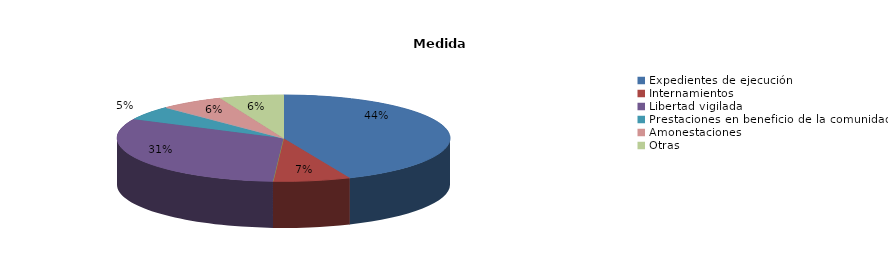
| Category | Series 0 |
|---|---|
| Expedientes de ejecución | 238 |
| Internamientos | 41 |
| Permanencias de fines de semana | 0 |
| Libertad vigilada | 171 |
| Prestaciones en beneficio de la comunidad | 29 |
| Privación de permisos y licencias | 0 |
| Convivencia Familiar Educativa | 0 |
| Amonestaciones | 34 |
| Otras | 34 |